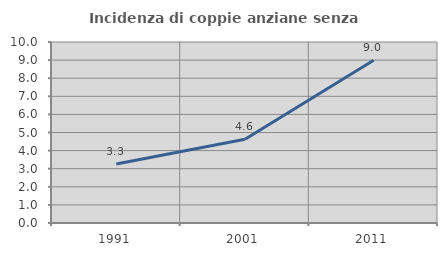
| Category | Incidenza di coppie anziane senza figli  |
|---|---|
| 1991.0 | 3.265 |
| 2001.0 | 4.622 |
| 2011.0 | 8.993 |